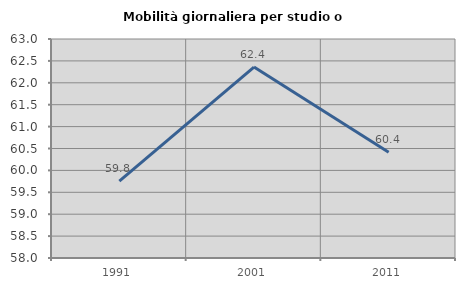
| Category | Mobilità giornaliera per studio o lavoro |
|---|---|
| 1991.0 | 59.755 |
| 2001.0 | 62.36 |
| 2011.0 | 60.417 |